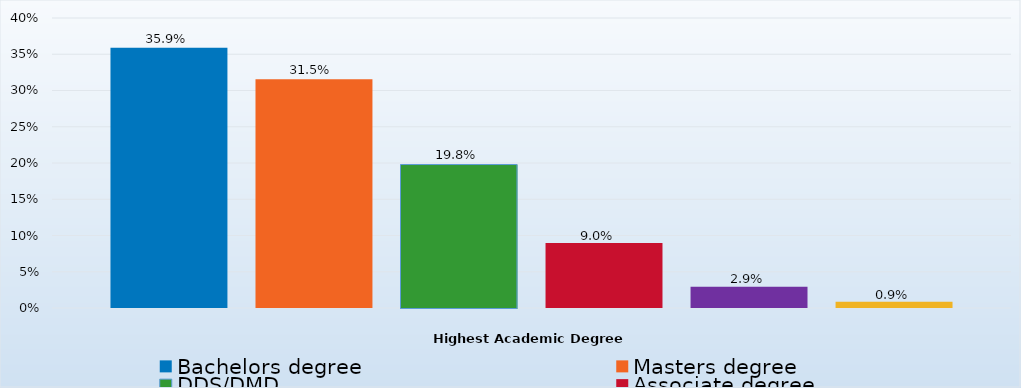
| Category | Bachelors degree | Masters degree | DDS/DMD | Associate degree | Doctorate degree | Certificate/Diploma/Other |
|---|---|---|---|---|---|---|
| Percent | 0.359 | 0.315 | 0.198 | 0.09 | 0.029 | 0.009 |